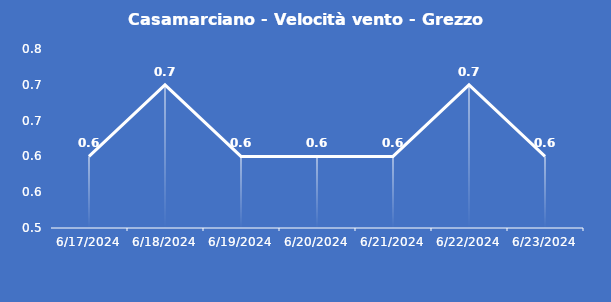
| Category | Casamarciano - Velocità vento - Grezzo (m/s) |
|---|---|
| 6/17/24 | 0.6 |
| 6/18/24 | 0.7 |
| 6/19/24 | 0.6 |
| 6/20/24 | 0.6 |
| 6/21/24 | 0.6 |
| 6/22/24 | 0.7 |
| 6/23/24 | 0.6 |